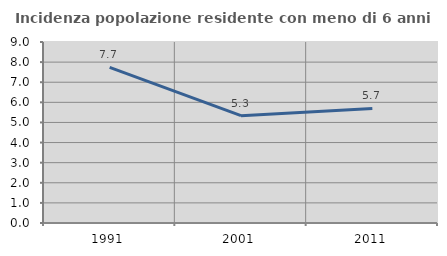
| Category | Incidenza popolazione residente con meno di 6 anni |
|---|---|
| 1991.0 | 7.734 |
| 2001.0 | 5.336 |
| 2011.0 | 5.699 |